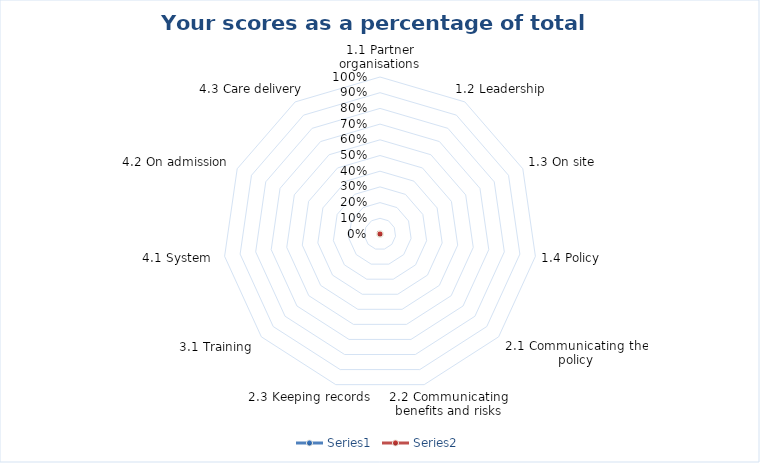
| Category | Series 0 | Series 1 |
|---|---|---|
| 1.1 Partner organisations | 0 | 0 |
| 1.2 Leadership | 0 | 0 |
| 1.3 On site | 0 | 0 |
| 1.4 Policy | 0 | 0 |
| 2.1 Communicating the policy | 0 | 0 |
| 2.2 Communicating benefits and risks | 0 | 0 |
| 2.3 Keeping records | 0 | 0 |
| 3.1 Training | 0 | 0 |
| 4.1 System  | 0 | 0 |
| 4.2 On admission | 0 | 0 |
| 4.3 Care delivery | 0 | 0 |